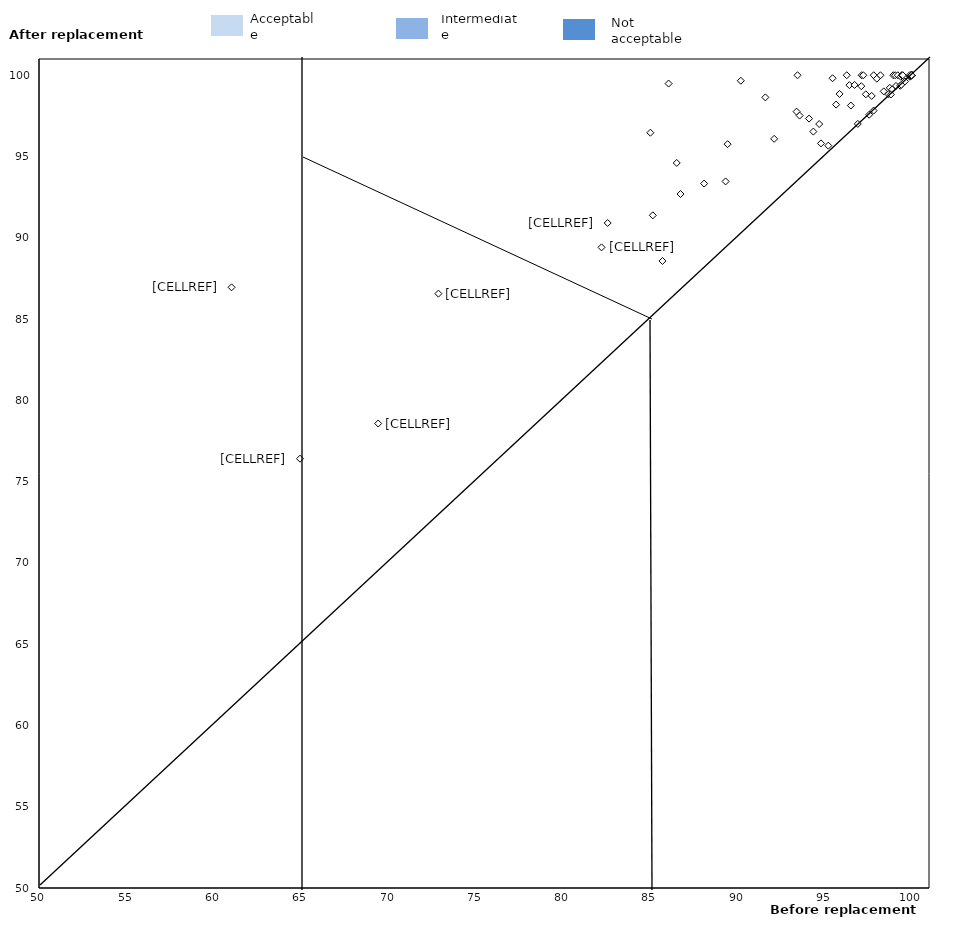
| Category | Series 0 |
|---|---|
| 61.0352632994668 | 86.952 |
| 64.9570798407974 | 76.412 |
| 69.4368803861943 | 78.574 |
| 72.88840603120626 | 86.565 |
| 82.2348031461575 | 89.412 |
| 82.5864694242194 | 90.912 |
| 85.0341920381377 | 96.464 |
| 85.175287098625 | 91.382 |
| 85.7273584865702 | 88.575 |
| 86.0785416070708 | 99.489 |
| 86.5442639478058 | 94.605 |
| 86.7615500698514 | 92.693 |
| 88.1146636155362 | 93.335 |
| 89.3442194084297 | 93.469 |
| 89.4596373607945 | 95.761 |
| 90.2170543712885 | 99.661 |
| 91.6238681123105 | 98.638 |
| 92.1271673906853 | 96.088 |
| 93.4135307298252 | 97.762 |
| 93.465695978611 | 100 |
| 93.5866822768092 | 97.518 |
| 94.1278659909644 | 97.333 |
| 94.3728833165832 | 96.534 |
| 94.7083484583392 | 96.999 |
| 94.8123016332016 | 95.808 |
| 95.2285642943516 | 95.671 |
| 95.4741970740905 | 99.816 |
| 95.6776 | 98.196 |
| 95.8752449847591 | 98.85 |
| 96.2862771488245 | 100 |
| 96.4401848799877 | 99.393 |
| 96.5231072282275 | 98.137 |
| 96.7341227990944 | 99.406 |
| 96.9204259043636 | 97.007 |
| 97.1199195017132 | 99.328 |
| 97.140500294632 | 100 |
| 97.2374958926032 | 100 |
| 97.3797968476573 | 98.829 |
| 97.5712283979449 | 97.571 |
| 97.716142737796 | 98.73 |
| 97.8262123856676 | 97.826 |
| 97.8286244515921 | 100 |
| 98.0106734631441 | 99.786 |
| 98.2189949375665 | 100 |
| 98.4053258508457 | 99.007 |
| 98.6746255802387 | 98.829 |
| 98.7543275948508 | 99.225 |
| 98.8153478602394 | 98.815 |
| 98.8945466950803 | 99.129 |
| 98.955438229576 | 100 |
| 99.0631180373663 | 100 |
| 99.1096044737345 | 99.344 |
| 99.2134200465874 | 100 |
| 99.3514896964207 | 99.351 |
| 99.3832918838068 | 99.91 |
| 99.41082262494 | 99.411 |
| 99.4380613564056 | 100 |
| 99.4561716697139 | 100 |
| 99.4964746343178 | 100 |
| 99.6191200600479 | 99.619 |
| 99.8929415303435 | 100 |
| 99.9060152908643 | 99.906 |
| 99.9309728732657 | 99.931 |
| 99.9499874968742 | 99.95 |
| 99.9649842185051 | 99.965 |
| 100.0 | 100 |
| 100.0 | 100 |
| 100.0 | 100 |
| 100.0 | 100 |
| 100.0 | 100 |
| 100.0 | 100 |
| 100.0 | 100 |
| 100.0 | 100 |
| 100.0 | 100 |
| 100.0 | 100 |
| 100.0 | 100 |
| 100.0 | 100 |
| 100.0 | 100 |
| 100.0 | 100 |